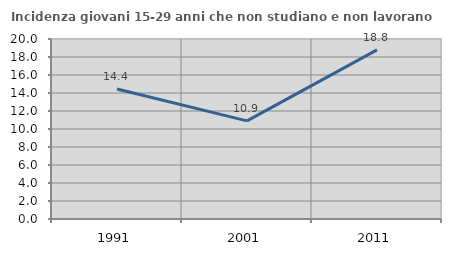
| Category | Incidenza giovani 15-29 anni che non studiano e non lavorano  |
|---|---|
| 1991.0 | 14.44 |
| 2001.0 | 10.905 |
| 2011.0 | 18.794 |